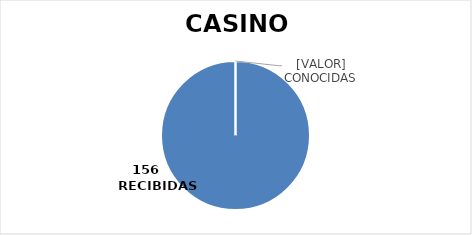
| Category | Series 0 |
|---|---|
| 0 | 156 |
| 1 | 0 |